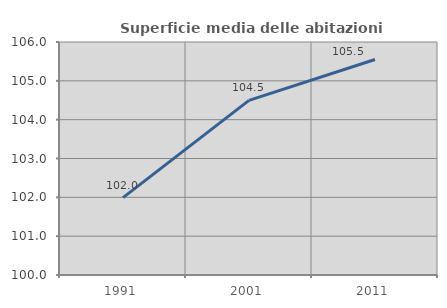
| Category | Superficie media delle abitazioni occupate |
|---|---|
| 1991.0 | 101.994 |
| 2001.0 | 104.495 |
| 2011.0 | 105.55 |